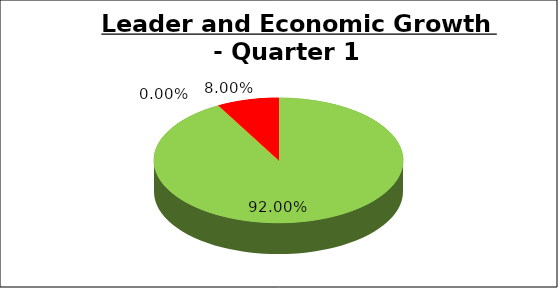
| Category | Q1 |
|---|---|
| Green | 0.92 |
| Amber | 0 |
| Red | 0.08 |